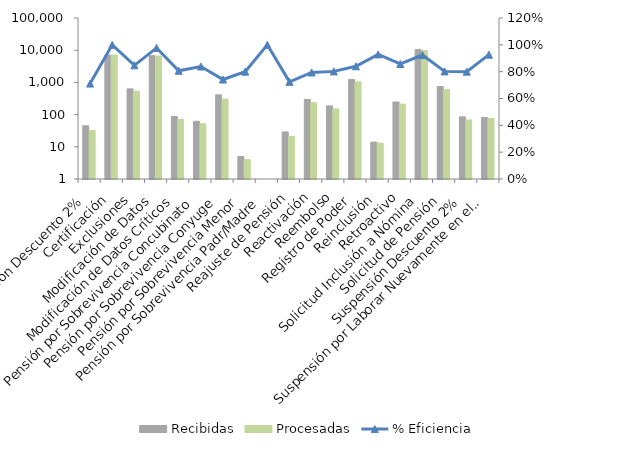
| Category | Recibidas | Procesadas |
|---|---|---|
| Aplicación Descuento 2% | 45 | 32 |
| Certificación  | 7073 | 7073 |
| Exclusiones | 629 | 533 |
| Modificación de Datos | 6737 | 6581 |
| Modificación de Datos Críticos | 88 | 71 |
| Pensión por Sobrevivencia Concubinato | 62 | 52 |
| Pensión por Sobrevivencia Conyuge | 410 | 304 |
| Pensión por Sobrevivencia Menor | 5 | 4 |
| Pensión por Sobrevivencia Padr/Madre | 1 | 1 |
| Reajuste de Pensión | 29 | 21 |
| Reactivación | 296 | 235 |
| Reembolso | 187 | 150 |
| Registro de Poder | 1237 | 1039 |
| Reinclusión | 14 | 13 |
| Retroactivo | 246 | 211 |
| Solicitud Inclusión a Nómina | 10557 | 9752 |
| Solicitud de Pensión | 743 | 596 |
| Suspensión Descuento 2% | 85 | 68 |
| Suspensión por Laborar Nuevamente en el Estado | 82 | 76 |